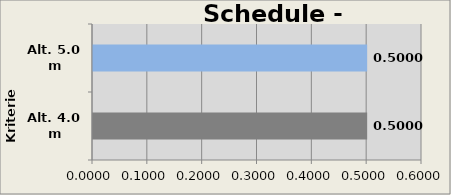
| Category | T. Duration |
|---|---|
| Alt. 4.0 m | 0.5 |
| Alt. 5.0 m | 0.5 |